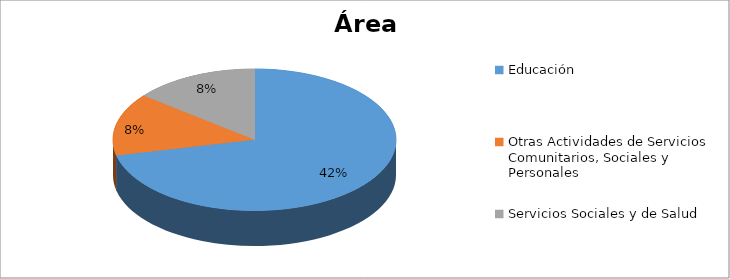
| Category | Series 0 |
|---|---|
| Educación | 0.417 |
| Otras Actividades de Servicios Comunitarios, Sociales y Personales | 0.083 |
| Servicios Sociales y de Salud | 0.083 |